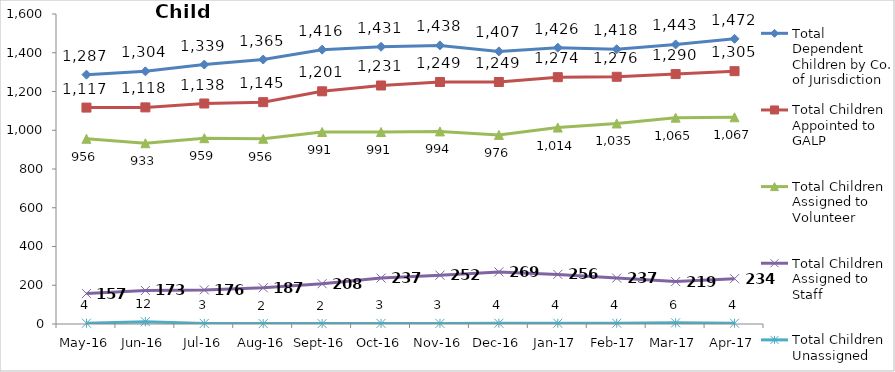
| Category | Total Dependent Children by Co. of Jurisdiction | Total Children Appointed to GALP | Total Children Assigned to Volunteer | Total Children Assigned to Staff | Total Children Unassigned |
|---|---|---|---|---|---|
| May-16 | 1287 | 1117 | 956 | 157 | 4 |
| Jun-16 | 1304 | 1118 | 933 | 173 | 12 |
| Jul-16 | 1339 | 1138 | 959 | 176 | 3 |
| Aug-16 | 1365 | 1145 | 956 | 187 | 2 |
| Sep-16 | 1416 | 1201 | 991 | 208 | 2 |
| Oct-16 | 1431 | 1231 | 991 | 237 | 3 |
| Nov-16 | 1438 | 1249 | 994 | 252 | 3 |
| Dec-16 | 1407 | 1249 | 976 | 269 | 4 |
| Jan-17 | 1426 | 1274 | 1014 | 256 | 4 |
| Feb-17 | 1418 | 1276 | 1035 | 237 | 4 |
| Mar-17 | 1443 | 1290 | 1065 | 219 | 6 |
| Apr-17 | 1472 | 1305 | 1067 | 234 | 4 |